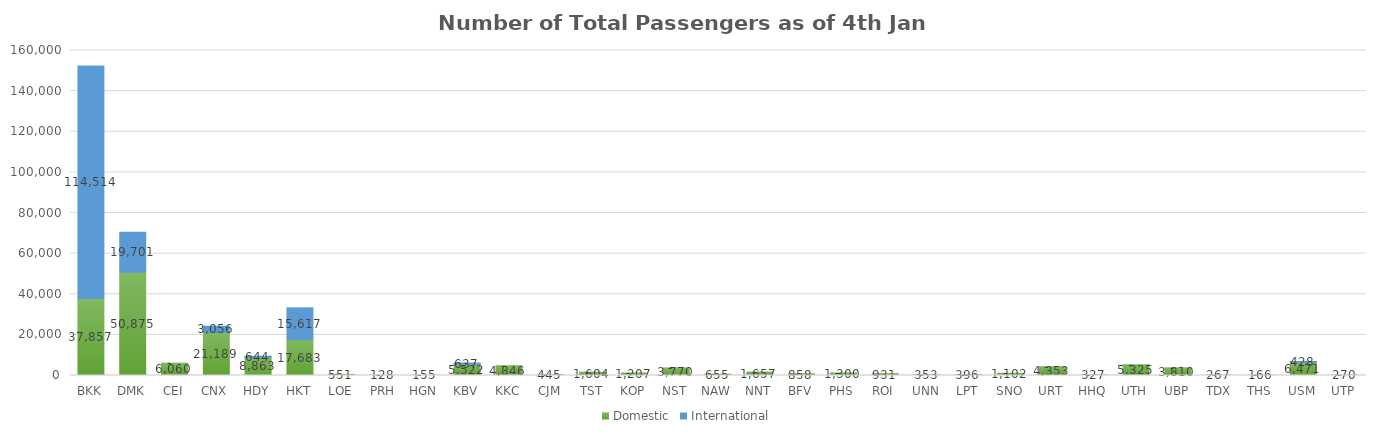
| Category | Domestic | International |
|---|---|---|
| BKK | 37857 | 114514 |
| DMK | 50875 | 19701 |
| CEI | 6060 | 0 |
| CNX | 21189 | 3056 |
| HDY | 8863 | 644 |
| HKT | 17683 | 15617 |
| LOE | 551 | 0 |
| PRH | 128 | 0 |
| HGN | 155 | 0 |
| KBV | 5522 | 637 |
| KKC | 4846 | 0 |
| CJM | 445 | 0 |
| TST | 1604 | 0 |
| KOP | 1207 | 0 |
| NST | 3770 | 0 |
| NAW | 655 | 0 |
| NNT | 1657 | 0 |
| BFV | 858 | 0 |
| PHS | 1300 | 0 |
| ROI | 931 | 0 |
| UNN | 353 | 0 |
| LPT | 396 | 0 |
| SNO | 1102 | 0 |
| URT | 4353 | 0 |
| HHQ | 327 | 0 |
| UTH | 5325 | 0 |
| UBP | 3810 | 0 |
| TDX | 267 | 0 |
| THS | 166 | 0 |
| USM | 6471 | 428 |
| UTP | 270 | 0 |